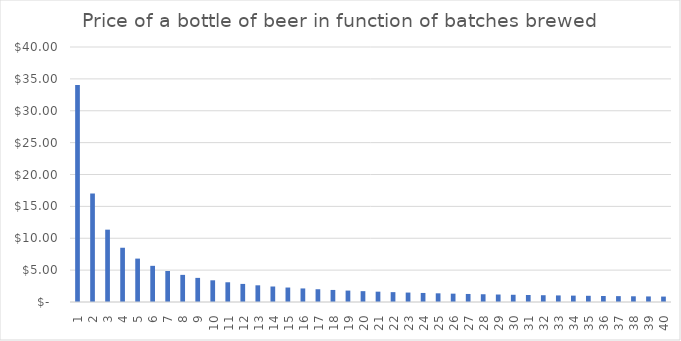
| Category | Series 0 |
|---|---|
| 1.0 | 34.04 |
| 2.0 | 17.02 |
| 3.0 | 11.347 |
| 4.0 | 8.51 |
| 5.0 | 6.808 |
| 6.0 | 5.673 |
| 7.0 | 4.863 |
| 8.0 | 4.255 |
| 9.0 | 3.782 |
| 10.0 | 3.404 |
| 11.0 | 3.095 |
| 12.0 | 2.837 |
| 13.0 | 2.618 |
| 14.0 | 2.431 |
| 15.0 | 2.269 |
| 16.0 | 2.127 |
| 17.0 | 2.002 |
| 18.0 | 1.891 |
| 19.0 | 1.792 |
| 20.0 | 1.702 |
| 21.0 | 1.621 |
| 22.0 | 1.547 |
| 23.0 | 1.48 |
| 24.0 | 1.418 |
| 25.0 | 1.362 |
| 26.0 | 1.309 |
| 27.0 | 1.261 |
| 28.0 | 1.216 |
| 29.0 | 1.174 |
| 30.0 | 1.135 |
| 31.0 | 1.098 |
| 32.0 | 1.064 |
| 33.0 | 1.032 |
| 34.0 | 1.001 |
| 35.0 | 0.973 |
| 36.0 | 0.946 |
| 37.0 | 0.92 |
| 38.0 | 0.896 |
| 39.0 | 0.873 |
| 40.0 | 0.851 |